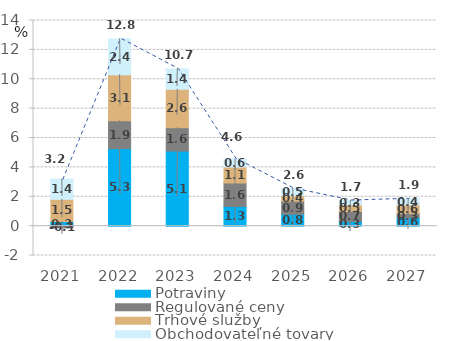
| Category | Potraviny | Regulované ceny | Trhové služby | Obchodovateľné tovary |
|---|---|---|---|---|
| 2021.0 | 0.315 | -0.122 | 1.506 | 1.381 |
| 2022.0 | 5.278 | 1.895 | 3.13 | 2.444 |
| 2023.0 | 5.111 | 1.59 | 2.614 | 1.385 |
| 2024.0 | 1.343 | 1.593 | 1.087 | 0.562 |
| 2025.0 | 0.809 | 0.884 | 0.376 | 0.488 |
| 2026.0 | 0.318 | 0.679 | 0.453 | 0.295 |
| 2027.0 | 0.578 | 0.277 | 0.591 | 0.417 |